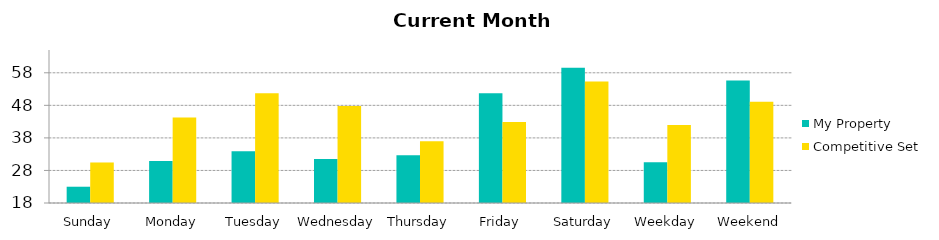
| Category | My Property | Competitive Set |
|---|---|---|
| Sunday | 23 | 30.446 |
| Monday | 30.9 | 44.273 |
| Tuesday | 33.9 | 51.701 |
| Wednesday | 31.5 | 47.831 |
| Thursday | 32.64 | 36.941 |
| Friday | 51.68 | 42.896 |
| Saturday | 59.52 | 55.306 |
| Weekday | 30.495 | 41.986 |
| Weekend | 55.6 | 49.101 |